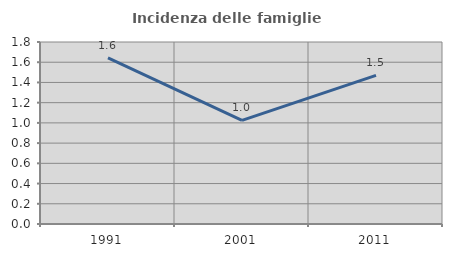
| Category | Incidenza delle famiglie numerose |
|---|---|
| 1991.0 | 1.643 |
| 2001.0 | 1.025 |
| 2011.0 | 1.471 |